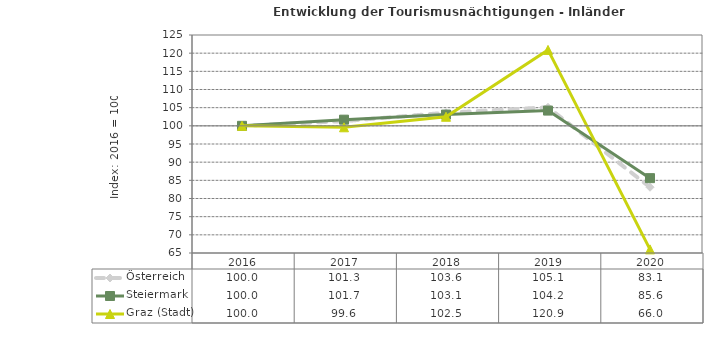
| Category | Österreich | Steiermark | Graz (Stadt) |
|---|---|---|---|
| 2020.0 | 83.1 | 85.6 | 66 |
| 2019.0 | 105.1 | 104.2 | 120.9 |
| 2018.0 | 103.6 | 103.1 | 102.5 |
| 2017.0 | 101.3 | 101.7 | 99.6 |
| 2016.0 | 100 | 100 | 100 |